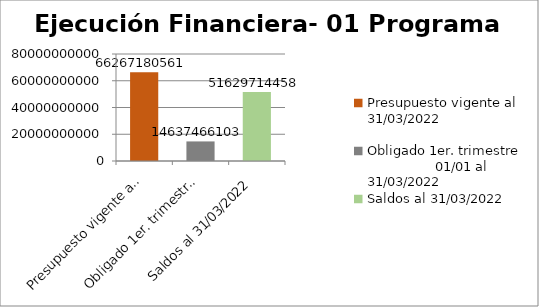
| Category | Presupuesto vigente al 31/03/2022 Obligado 1er. trimestre                      01/01 al 31/03/2022 Saldos al 31/03/2022 |
|---|---|
| Presupuesto vigente al 31/03/2022 | 66267180561 |
| Obligado 1er. trimestre                      01/01 al 31/03/2022 | 14637466103 |
| Saldos al 31/03/2022 | 51629714458 |